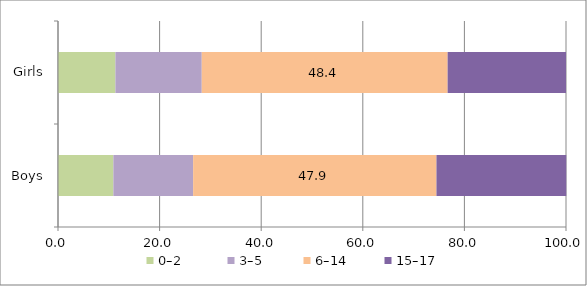
| Category | 0–2   | 3–5  | 6–14 | 15–17 |
|---|---|---|---|---|
| Boys | 10.9 | 15.7 | 47.9 | 25.55 |
| Girls | 11.3 | 17 | 48.4 | 23.3 |